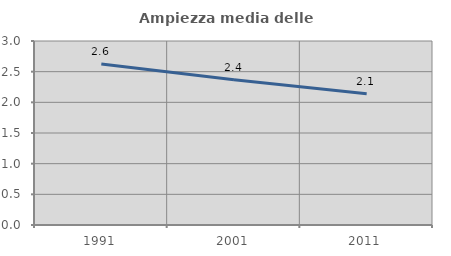
| Category | Ampiezza media delle famiglie |
|---|---|
| 1991.0 | 2.623 |
| 2001.0 | 2.367 |
| 2011.0 | 2.139 |